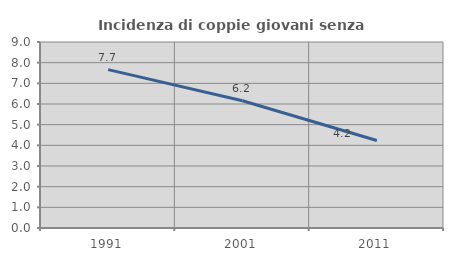
| Category | Incidenza di coppie giovani senza figli |
|---|---|
| 1991.0 | 7.663 |
| 2001.0 | 6.159 |
| 2011.0 | 4.235 |